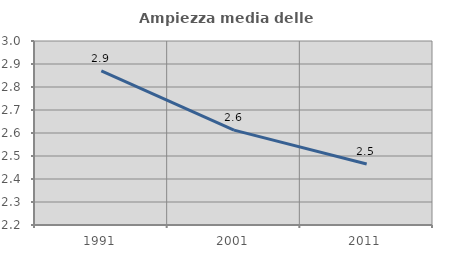
| Category | Ampiezza media delle famiglie |
|---|---|
| 1991.0 | 2.87 |
| 2001.0 | 2.612 |
| 2011.0 | 2.465 |